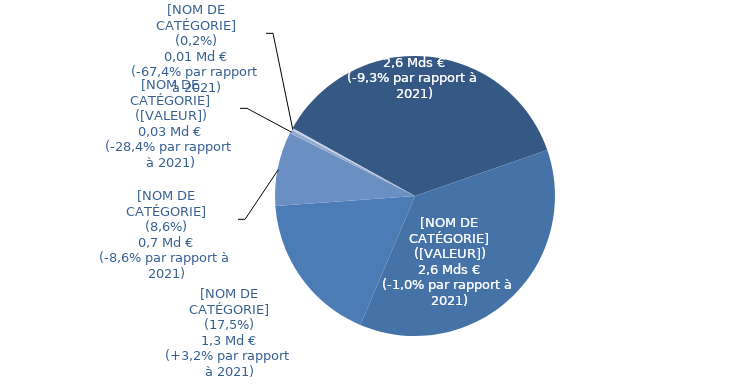
| Category | Series 0 |
|---|---|
| ITAF | 0.366 |
| Contributions Régime général | 0 |
| Compensation démographique | 0.367 |
| Cotisations sociales | 0.175 |
| Autres produits** | 0.086 |
| Prise en charge de prestations* | 0.004 |
| Contribution Sociale Généralisée | 0 |
| Cotisations prises en charge par l'Etat | 0.002 |